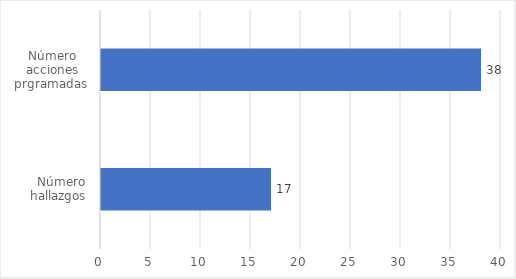
| Category | Series 0 |
|---|---|
| Número hallazgos  | 17 |
| Número acciones prgramadas  | 38 |